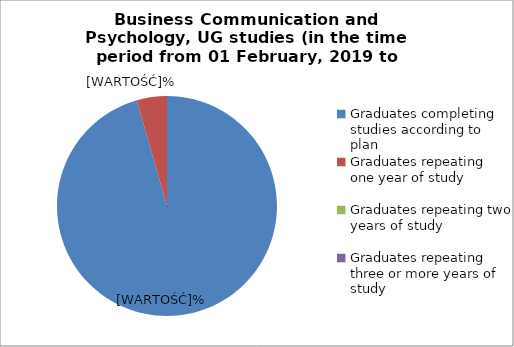
| Category | Series 0 |
|---|---|
| Graduates completing studies according to plan | 95.556 |
| Graduates repeating one year of study | 4.444 |
| Graduates repeating two years of study | 0 |
| Graduates repeating three or more years of study | 0 |